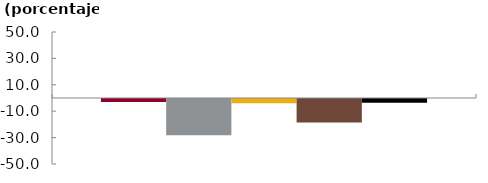
| Category | Bancos | CF | CFC | Coop | Sistema |
|---|---|---|---|---|---|
|  | -2.273 | -27.398 | -3.262 | -17.829 | -2.856 |